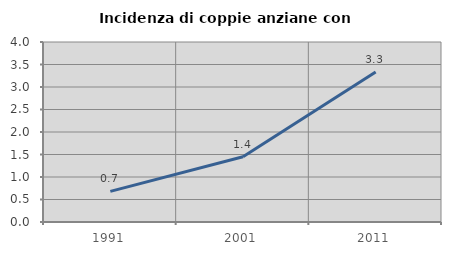
| Category | Incidenza di coppie anziane con figli |
|---|---|
| 1991.0 | 0.68 |
| 2001.0 | 1.449 |
| 2011.0 | 3.333 |